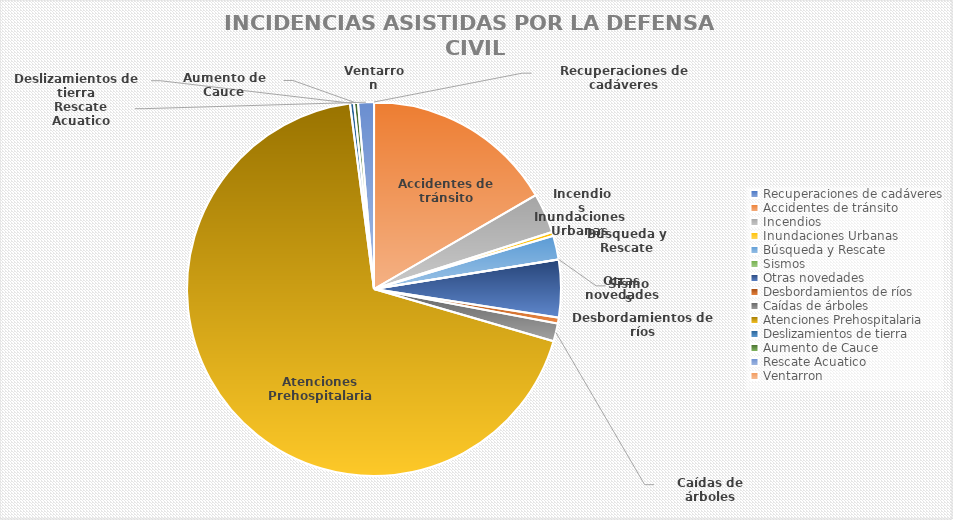
| Category | Series 0 |
|---|---|
| Recuperaciones de cadáveres | 0 |
| Accidentes de tránsito | 97 |
| Incendios | 20 |
| Inundaciones Urbanas | 2 |
| Búsqueda y Rescate | 12 |
| Sismos | 0 |
| Otras novedades | 29 |
| Desbordamientos de ríos | 3 |
| Caídas de árboles | 9 |
| Atenciones Prehospitalaria | 399 |
| Deslizamientos de tierra | 2 |
| Aumento de Cauce | 2 |
| Rescate Acuatico | 8 |
| Ventarron | 0 |